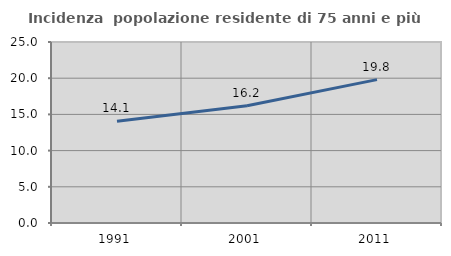
| Category | Incidenza  popolazione residente di 75 anni e più |
|---|---|
| 1991.0 | 14.051 |
| 2001.0 | 16.187 |
| 2011.0 | 19.806 |